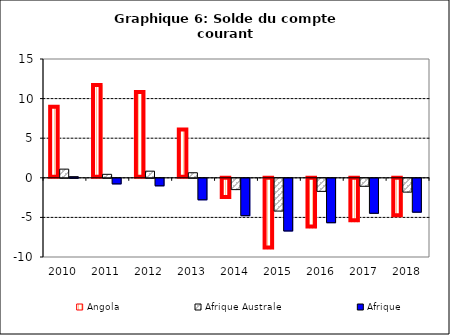
| Category | Angola | Afrique Australe | Afrique |
|---|---|---|---|
| 2010.0 | 8.957 | 1.095 | 0.144 |
| 2011.0 | 11.705 | 0.439 | -0.706 |
| 2012.0 | 10.818 | 0.839 | -0.95 |
| 2013.0 | 6.101 | 0.638 | -2.715 |
| 2014.0 | -2.555 | -1.429 | -4.722 |
| 2015.0 | -8.925 | -4.138 | -6.65 |
| 2016.0 | -6.286 | -1.65 | -5.608 |
| 2017.0 | -5.496 | -1.011 | -4.418 |
| 2018.0 | -4.848 | -1.744 | -4.278 |